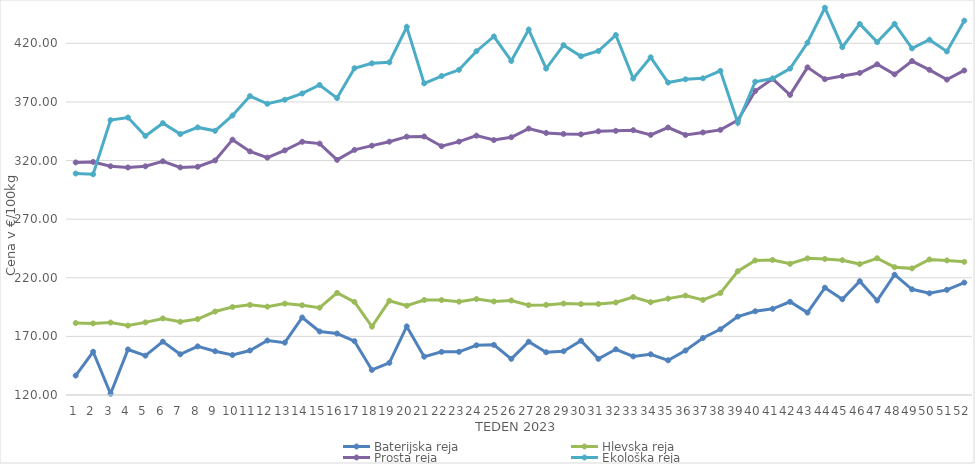
| Category | Series 1 | Baterijska reja | Hlevska reja | Prosta reja | Ekološka reja |
|---|---|---|---|---|---|
| 0 | 1 | 136.59 | 181.38 | 318.4 | 308.97 |
| 1 | 2 | 156.88 | 181.07 | 318.82 | 308.28 |
| 2 | 3 | 121.07 | 181.83 | 315.14 | 354.48 |
| 3 | 4 | 158.82 | 179.22 | 314.08 | 356.72 |
| 4 | 5 | 153.55 | 181.96 | 315.1 | 341.03 |
| 5 | 6 | 165.51 | 185.31 | 319.38 | 351.9 |
| 6 | 7 | 154.74 | 182.45 | 314.16 | 342.59 |
| 7 | 8 | 161.48 | 184.77 | 314.71 | 348.28 |
| 8 | 9 | 157.38 | 191.21 | 320.1 | 345.35 |
| 9 | 10 | 154.16 | 195.04 | 337.83 | 358.45 |
| 10 | 11 | 157.96 | 196.88 | 327.79 | 375 |
| 11 | 12 | 166.49 | 195.36 | 322.46 | 368.45 |
| 12 | 13 | 164.66 | 197.95 | 328.67 | 371.9 |
| 13 | 14 | 186.11 | 196.59 | 336.02 | 377.24 |
| 14 | 15 | 174.18 | 194.49 | 334.46 | 384.48 |
| 15 | 16 | 172.42 | 207.1 | 320.58 | 373.28 |
| 16 | 17 | 165.96 | 199.41 | 329.11 | 398.79 |
| 17 | 18 | 141.36 | 178.29 | 332.71 | 402.93 |
| 18 | 19 | 147.43 | 200.37 | 336.11 | 403.79 |
| 19 | 20 | 178.51 | 196.16 | 340.4 | 433.97 |
| 20 | 21 | 152.67 | 201.05 | 340.55 | 385.86 |
| 21 | 22 | 156.8 | 200.98 | 332.23 | 392.07 |
| 22 | 23 | 156.84 | 199.63 | 336.16 | 397.41 |
| 23 | 24 | 162.44 | 201.86 | 341.24 | 413.28 |
| 24 | 25 | 162.78 | 199.81 | 337.48 | 425.86 |
| 25 | 26 | 150.82 | 200.65 | 339.9 | 405 |
| 26 | 27 | 165.45 | 196.64 | 347.3 | 431.72 |
| 27 | 28 | 156.46 | 196.88 | 343.56 | 398.45 |
| 28 | 29 | 157.31 | 198.03 | 342.71 | 418.45 |
| 29 | 30 | 166.29 | 197.55 | 342.35 | 408.97 |
| 30 | 31 | 150.81 | 197.66 | 344.97 | 413.45 |
| 31 | 32 | 158.99 | 198.9 | 345.35 | 427.07 |
| 32 | 33 | 152.91 | 203.57 | 345.9 | 390 |
| 33 | 34 | 154.73 | 199.17 | 341.92 | 408.1 |
| 34 | 35 | 149.6 | 202.21 | 348.2 | 386.55 |
| 35 | 36 | 157.93 | 204.81 | 341.85 | 389.31 |
| 36 | 37 | 168.61 | 201.11 | 343.97 | 390.17 |
| 37 | 38 | 176.07 | 206.91 | 346.16 | 396.55 |
| 38 | 39 | 186.86 | 225.6 | 354.41 | 352.24 |
| 39 | 40 | 191.45 | 234.79 | 379.35 | 387.24 |
| 40 | 41 | 193.52 | 235.24 | 389.75 | 390 |
| 41 | 42 | 199.51 | 231.92 | 376.02 | 398.45 |
| 42 | 43 | 190.28 | 236.56 | 399.51 | 420.52 |
| 43 | 44 | 211.53 | 236.04 | 389.44 | 450.35 |
| 44 | 45 | 201.69 | 235.01 | 392.15 | 416.72 |
| 45 | 46 | 217.08 | 231.68 | 394.71 | 436.55 |
| 46 | 47 | 200.62 | 236.65 | 402.12 | 421.03 |
| 47 | 48 | 222.61 | 229.05 | 393.56 | 436.55 |
| 48 | 49 | 210.16 | 228.03 | 404.87 | 415.69 |
| 49 | 50 | 206.76 | 235.63 | 397.4 | 423.1 |
| 50 | 51 | 209.69 | 234.79 | 389.05 | 413.1 |
| 51 | 52 | 215.87 | 233.58 | 396.87 | 439.31 |